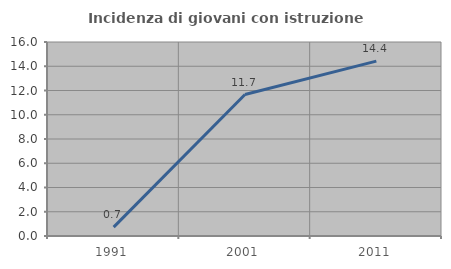
| Category | Incidenza di giovani con istruzione universitaria |
|---|---|
| 1991.0 | 0.735 |
| 2001.0 | 11.667 |
| 2011.0 | 14.423 |